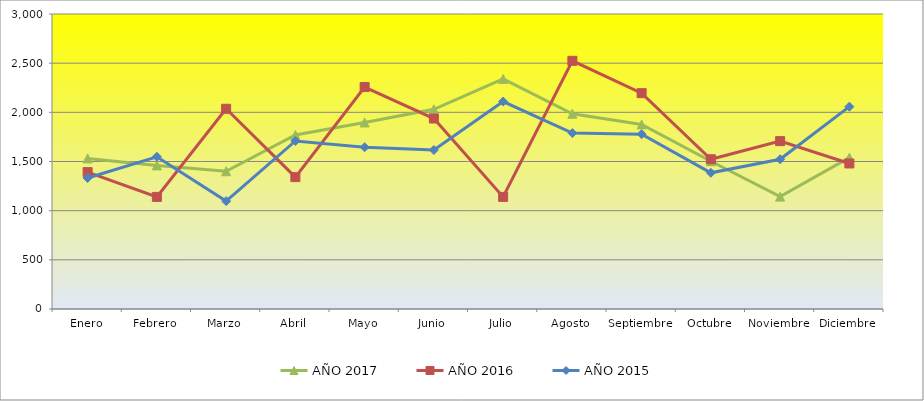
| Category | AÑO 2017 | AÑO 2016 | AÑO 2015 |
|---|---|---|---|
| Enero | 1531.343 | 1392 | 1332 |
| Febrero | 1460.448 | 1140 | 1548 |
| Marzo | 1400.896 | 2036 | 1097 |
| Abril | 1769.552 | 1341 | 1709 |
| Mayo | 1897.164 | 2257 | 1645 |
| Junio | 2030.448 | 1937 | 1617 |
| Julio | 2339.552 | 1140 | 2110 |
| Agosto | 1985.075 | 2524 | 1789 |
| Septiembre | 1877.313 | 2195 | 1778 |
| Octubre | 1502.857 | 1523 | 1385 |
| Noviembre | 1142.857 | 1707 | 1523 |
| Diciembre | 1539.851 | 1480 | 2058 |